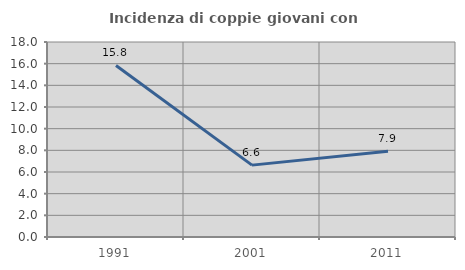
| Category | Incidenza di coppie giovani con figli |
|---|---|
| 1991.0 | 15.833 |
| 2001.0 | 6.635 |
| 2011.0 | 7.914 |